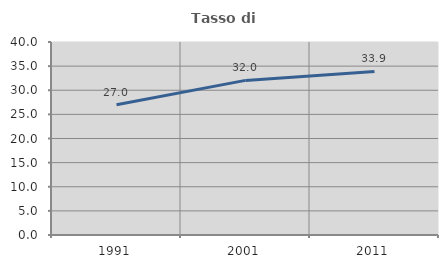
| Category | Tasso di occupazione   |
|---|---|
| 1991.0 | 27 |
| 2001.0 | 32.043 |
| 2011.0 | 33.908 |